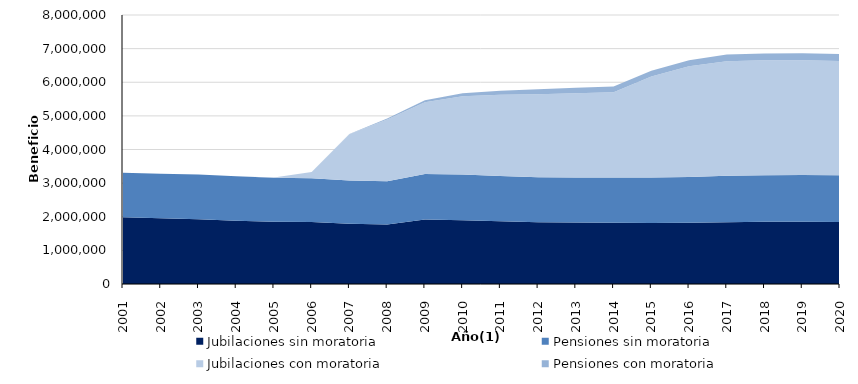
| Category | Jubilaciones sin moratoria | Pensiones sin moratoria | Jubilaciones con moratoria | Pensiones con moratoria |
|---|---|---|---|---|
| 2001.0 | 1984587.917 | 1327098.25 | 0 | 0 |
| 2002.0 | 1953410.083 | 1327077.167 | 0 | 0 |
| 2003.0 | 1925530.75 | 1327478.333 | 0 | 0 |
| 2004.0 | 1881671 | 1319835.167 | 0 | 0 |
| 2005.0 | 1852155 | 1308369.167 | 4812.167 | 0 |
| 2006.0 | 1842055 | 1302065.333 | 189380.417 | 446.417 |
| 2007.0 | 1790011.75 | 1285209.75 | 1377787.667 | 7344.583 |
| 2008.0 | 1771744.083 | 1283423.333 | 1839418.25 | 24810.25 |
| 2009.0 | 1916019.667 | 1353042.417 | 2137646 | 54754.833 |
| 2010.0 | 1899421.5 | 1357224.167 | 2324976.167 | 90525.083 |
| 2011.0 | 1865138.167 | 1345193.333 | 2416197 | 122329.417 |
| 2012.0 | 1839912.583 | 1334918.417 | 2469455 | 148526 |
| 2013.0 | 1826652.75 | 1339222.167 | 2505563.083 | 162567.5 |
| 2014.0 | 1818718.333 | 1345246.083 | 2539028 | 169685.583 |
| 2015.0 | 1814622.25 | 1352098.917 | 3000779.5 | 174685.917 |
| 2016.0 | 1818029.917 | 1362099 | 3293148 | 184628.5 |
| 2017.0 | 1839491 | 1377608.917 | 3410194.917 | 196656.167 |
| 2018.0 | 1852047 | 1385403.917 | 3413909 | 203132.917 |
| 2019.0 | 1849453.167 | 1389261.167 | 3417398.917 | 206948.5 |
| 2020.0 | 1843198 | 1394635.25 | 3394386.417 | 208912.667 |